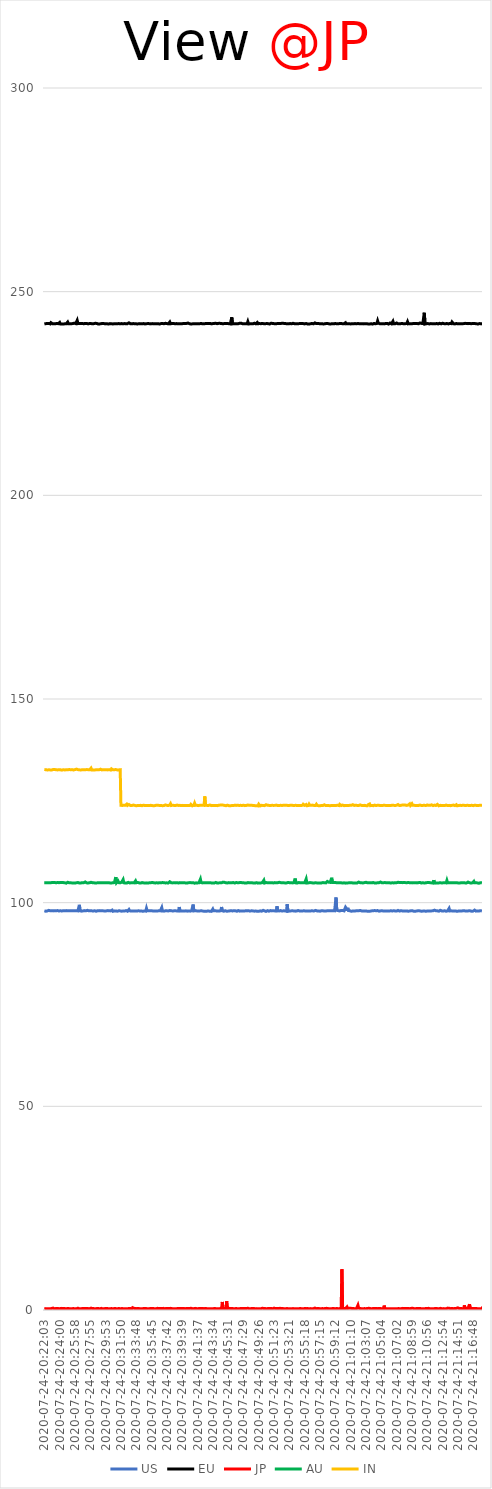
| Category | US | EU | JP | AU | IN |
|---|---|---|---|---|---|
| 2020-07-24-20:22:03 | 98.004 | 242.094 | 0.312 | 104.917 | 132.697 |
| 2020-07-24-20:22:08 | 98.008 | 242.156 | 0.376 | 104.929 | 132.523 |
| 2020-07-24-20:22:14 | 97.902 | 242.138 | 0.339 | 104.917 | 132.633 |
| 2020-07-24-20:22:20 | 97.986 | 242.236 | 0.309 | 104.878 | 132.759 |
| 2020-07-24-20:22:25 | 97.966 | 242.196 | 0.328 | 104.888 | 132.587 |
| 2020-07-24-20:22:31 | 98.046 | 242.124 | 0.321 | 104.858 | 132.568 |
| 2020-07-24-20:22:36 | 98.113 | 242.201 | 0.301 | 104.906 | 132.607 |
| 2020-07-24-20:22:42 | 98.022 | 242.107 | 0.298 | 104.881 | 132.682 |
| 2020-07-24-20:22:48 | 98.019 | 242.09 | 0.294 | 104.88 | 132.597 |
| 2020-07-24-20:22:53 | 98.047 | 242.385 | 0.294 | 104.947 | 132.607 |
| 2020-07-24-20:22:59 | 98.038 | 242.17 | 0.373 | 104.932 | 132.574 |
| 2020-07-24-20:23:04 | 97.975 | 242.144 | 0.353 | 104.883 | 132.554 |
| 2020-07-24-20:23:10 | 97.98 | 242.132 | 0.47 | 104.967 | 132.696 |
| 2020-07-24-20:23:16 | 97.97 | 242.138 | 0.304 | 104.886 | 132.573 |
| 2020-07-24-20:23:21 | 98.042 | 242.142 | 0.296 | 104.967 | 132.712 |
| 2020-07-24-20:23:27 | 98.04 | 242.104 | 0.345 | 104.941 | 132.658 |
| 2020-07-24-20:23:32 | 98.031 | 242.161 | 0.376 | 104.883 | 132.614 |
| 2020-07-24-20:23:38 | 98.014 | 242.209 | 0.34 | 104.906 | 132.591 |
| 2020-07-24-20:23:44 | 98.052 | 242.055 | 0.389 | 104.95 | 132.595 |
| 2020-07-24-20:23:49 | 97.982 | 242.134 | 0.334 | 104.937 | 132.639 |
| 2020-07-24-20:23:55 | 97.957 | 242.131 | 0.321 | 104.91 | 132.62 |
| 2020-07-24-20:24:00 | 97.969 | 242.441 | 0.339 | 104.934 | 132.683 |
| 2020-07-24-20:24:06 | 98.016 | 242.08 | 0.347 | 104.949 | 132.62 |
| 2020-07-24-20:24:12 | 98.004 | 242.171 | 0.315 | 104.845 | 132.594 |
| 2020-07-24-20:24:17 | 97.952 | 242.062 | 0.399 | 104.959 | 132.536 |
| 2020-07-24-20:24:23 | 98.084 | 242.069 | 0.296 | 104.878 | 132.609 |
| 2020-07-24-20:24:28 | 98.033 | 242.077 | 0.345 | 104.928 | 132.645 |
| 2020-07-24-20:24:34 | 97.935 | 242.108 | 0.302 | 104.833 | 132.636 |
| 2020-07-24-20:24:40 | 98.025 | 242.098 | 0.357 | 104.883 | 132.584 |
| 2020-07-24-20:24:45 | 97.975 | 242.148 | 0.355 | 104.937 | 132.655 |
| 2020-07-24-20:24:51 | 98.048 | 242.101 | 0.284 | 104.789 | 132.625 |
| 2020-07-24-20:24:56 | 98.016 | 242.135 | 0.404 | 104.945 | 132.583 |
| 2020-07-24-20:25:02 | 98.017 | 242.535 | 0.381 | 105.006 | 132.601 |
| 2020-07-24-20:25:07 | 97.929 | 242.134 | 0.366 | 105.055 | 132.639 |
| 2020-07-24-20:25:13 | 97.986 | 242.194 | 0.338 | 104.874 | 132.694 |
| 2020-07-24-20:25:19 | 97.996 | 242.111 | 0.358 | 104.933 | 132.565 |
| 2020-07-24-20:25:24 | 98.034 | 242.125 | 0.304 | 104.863 | 132.636 |
| 2020-07-24-20:25:30 | 98.06 | 242.123 | 0.339 | 104.893 | 132.62 |
| 2020-07-24-20:25:35 | 98.03 | 242.163 | 0.332 | 104.854 | 132.667 |
| 2020-07-24-20:25:41 | 97.991 | 242.171 | 0.356 | 104.853 | 132.667 |
| 2020-07-24-20:25:47 | 98.004 | 242.156 | 0.35 | 104.806 | 132.577 |
| 2020-07-24-20:25:52 | 98.011 | 242.271 | 0.395 | 104.87 | 132.635 |
| 2020-07-24-20:25:58 | 97.989 | 242.104 | 0.285 | 104.826 | 132.668 |
| 2020-07-24-20:26:03 | 97.936 | 242.149 | 0.346 | 104.937 | 132.628 |
| 2020-07-24-20:26:09 | 98.031 | 242.076 | 0.287 | 104.877 | 132.781 |
| 2020-07-24-20:26:15 | 97.905 | 242.943 | 0.349 | 104.746 | 132.598 |
| 2020-07-24-20:26:20 | 97.985 | 242.158 | 0.444 | 104.948 | 132.659 |
| 2020-07-24-20:26:26 | 98.032 | 242.121 | 0.346 | 104.924 | 132.569 |
| 2020-07-24-20:26:31 | 99.468 | 242.178 | 0.291 | 104.829 | 132.609 |
| 2020-07-24-20:26:37 | 98.009 | 242.088 | 0.344 | 104.87 | 132.571 |
| 2020-07-24-20:26:43 | 97.959 | 242.207 | 0.32 | 104.838 | 132.579 |
| 2020-07-24-20:26:48 | 97.921 | 242.14 | 0.317 | 104.899 | 132.668 |
| 2020-07-24-20:26:54 | 98.036 | 242.194 | 0.35 | 104.909 | 132.626 |
| 2020-07-24-20:26:59 | 97.978 | 242.205 | 0.42 | 104.875 | 132.693 |
| 2020-07-24-20:27:05 | 98.018 | 242.122 | 0.347 | 104.902 | 132.634 |
| 2020-07-24-20:27:11 | 98.048 | 242.181 | 0.352 | 104.855 | 132.626 |
| 2020-07-24-20:27:16 | 97.971 | 242.208 | 0.362 | 105.095 | 132.648 |
| 2020-07-24-20:27:22 | 98.004 | 242.185 | 0.305 | 104.928 | 132.628 |
| 2020-07-24-20:27:27 | 97.999 | 242.187 | 0.344 | 104.859 | 132.666 |
| 2020-07-24-20:27:33 | 98.112 | 242.129 | 0.33 | 104.857 | 132.697 |
| 2020-07-24-20:27:39 | 97.989 | 242.097 | 0.344 | 104.84 | 132.658 |
| 2020-07-24-20:27:44 | 98.007 | 242.161 | 0.361 | 104.968 | 132.673 |
| 2020-07-24-20:27:50 | 97.998 | 242.181 | 0.314 | 104.888 | 132.657 |
| 2020-07-24-20:27:55 | 98.001 | 242.142 | 0.36 | 104.943 | 132.634 |
| 2020-07-24-20:28:01 | 98.012 | 242.17 | 0.459 | 104.997 | 133.035 |
| 2020-07-24-20:28:07 | 97.987 | 242.107 | 0.328 | 104.904 | 132.574 |
| 2020-07-24-20:28:12 | 97.987 | 242.117 | 0.343 | 104.899 | 132.685 |
| 2020-07-24-20:28:18 | 97.97 | 242.163 | 0.383 | 104.898 | 132.576 |
| 2020-07-24-20:28:23 | 97.988 | 242.156 | 0.338 | 104.863 | 132.64 |
| 2020-07-24-20:28:29 | 98.004 | 242.152 | 0.345 | 104.897 | 132.578 |
| 2020-07-24-20:28:34 | 97.994 | 242.236 | 0.311 | 104.847 | 132.601 |
| 2020-07-24-20:28:40 | 97.886 | 242.056 | 0.301 | 104.862 | 132.625 |
| 2020-07-24-20:28:46 | 97.956 | 242.193 | 0.349 | 104.858 | 132.583 |
| 2020-07-24-20:28:51 | 98.029 | 242.24 | 0.359 | 104.906 | 132.614 |
| 2020-07-24-20:28:57 | 97.996 | 242.048 | 0.37 | 104.87 | 132.627 |
| 2020-07-24-20:29:02 | 98.046 | 242.119 | 0.359 | 104.996 | 132.607 |
| 2020-07-24-20:29:08 | 97.99 | 242.085 | 0.294 | 104.887 | 132.594 |
| 2020-07-24-20:29:14 | 98.029 | 242.159 | 0.318 | 104.919 | 132.774 |
| 2020-07-24-20:29:19 | 98.033 | 242.151 | 0.396 | 104.918 | 132.675 |
| 2020-07-24-20:29:25 | 98.017 | 242.081 | 0.357 | 104.866 | 132.595 |
| 2020-07-24-20:29:30 | 98.025 | 242.183 | 0.304 | 104.918 | 132.672 |
| 2020-07-24-20:29:36 | 97.985 | 242.125 | 0.334 | 104.828 | 132.621 |
| 2020-07-24-20:29:42 | 98.008 | 242.153 | 0.316 | 104.862 | 132.599 |
| 2020-07-24-20:29:47 | 97.952 | 242.205 | 0.289 | 104.948 | 132.632 |
| 2020-07-24-20:29:53 | 98.064 | 242.092 | 0.375 | 104.863 | 132.633 |
| 2020-07-24-20:29:58 | 97.984 | 242.16 | 0.326 | 104.99 | 132.644 |
| 2020-07-24-20:30:04 | 98.061 | 242.12 | 0.37 | 104.917 | 132.769 |
| 2020-07-24-20:30:10 | 98.059 | 242.187 | 0.298 | 104.886 | 132.594 |
| 2020-07-24-20:30:15 | 97.968 | 242.06 | 0.303 | 104.912 | 132.616 |
| 2020-07-24-20:30:21 | 97.993 | 242.108 | 0.381 | 104.876 | 132.661 |
| 2020-07-24-20:30:26 | 97.926 | 242.16 | 0.307 | 104.837 | 132.697 |
| 2020-07-24-20:30:32 | 97.984 | 242.125 | 0.319 | 104.878 | 132.558 |
| 2020-07-24-20:30:38 | 98.042 | 242.113 | 0.355 | 104.829 | 132.848 |
| 2020-07-24-20:30:43 | 98.174 | 242.102 | 0.314 | 104.966 | 132.824 |
| 2020-07-24-20:30:49 | 97.884 | 242.079 | 0.281 | 104.897 | 132.615 |
| 2020-07-24-20:30:54 | 97.933 | 242.168 | 0.372 | 104.848 | 132.584 |
| 2020-07-24-20:31:00 | 97.985 | 242.126 | 0.369 | 104.922 | 132.641 |
| 2020-07-24-20:31:06 | 97.978 | 242.206 | 0.32 | 104.93 | 132.7 |
| 2020-07-24-20:31:11 | 97.97 | 242.148 | 0.342 | 106.278 | 132.679 |
| 2020-07-24-20:31:17 | 97.96 | 242.113 | 0.325 | 104.905 | 132.664 |
| 2020-07-24-20:31:22 | 97.902 | 242.113 | 0.302 | 104.902 | 132.592 |
| 2020-07-24-20:31:28 | 98.011 | 242.089 | 0.334 | 105.322 | 132.62 |
| 2020-07-24-20:31:33 | 97.998 | 242.167 | 0.364 | 104.918 | 132.6 |
| 2020-07-24-20:31:39 | 98.008 | 242.103 | 0.432 | 105.11 | 132.679 |
| 2020-07-24-20:31:45 | 97.981 | 242.112 | 0.317 | 104.877 | 132.634 |
| 2020-07-24-20:31:50 | 97.987 | 242.184 | 0.359 | 104.895 | 123.892 |
| 2020-07-24-20:31:56 | 97.912 | 242.16 | 0.344 | 105.018 | 123.856 |
| 2020-07-24-20:32:01 | 97.978 | 242.098 | 0.455 | 104.878 | 123.874 |
| 2020-07-24-20:32:07 | 97.942 | 242.115 | 0.335 | 105.665 | 123.895 |
| 2020-07-24-20:32:13 | 98.01 | 242.211 | 0.383 | 104.885 | 123.903 |
| 2020-07-24-20:32:18 | 97.947 | 242.157 | 0.289 | 104.835 | 123.78 |
| 2020-07-24-20:32:24 | 98.004 | 242.117 | 0.329 | 104.818 | 123.891 |
| 2020-07-24-20:32:29 | 98.051 | 242.148 | 0.317 | 104.848 | 123.826 |
| 2020-07-24-20:32:35 | 97.942 | 242.176 | 0.334 | 104.824 | 124.188 |
| 2020-07-24-20:32:41 | 97.903 | 242.151 | 0.314 | 104.801 | 123.88 |
| 2020-07-24-20:32:46 | 97.957 | 242.116 | 0.314 | 104.984 | 123.879 |
| 2020-07-24-20:32:52 | 98.319 | 242.348 | 0.371 | 104.869 | 124.101 |
| 2020-07-24-20:32:57 | 97.988 | 242.164 | 0.362 | 104.851 | 123.889 |
| 2020-07-24-20:33:03 | 97.914 | 242.124 | 0.351 | 104.858 | 123.855 |
| 2020-07-24-20:33:08 | 97.966 | 242.175 | 0.35 | 104.867 | 123.902 |
| 2020-07-24-20:33:14 | 97.891 | 242.113 | 0.292 | 104.837 | 123.856 |
| 2020-07-24-20:33:20 | 97.962 | 242.119 | 0.57 | 104.895 | 123.824 |
| 2020-07-24-20:33:25 | 97.971 | 242.173 | 0.406 | 104.948 | 123.96 |
| 2020-07-24-20:33:31 | 97.974 | 242.14 | 0.4 | 104.862 | 124.056 |
| 2020-07-24-20:33:36 | 98.003 | 242.099 | 0.345 | 104.9 | 123.871 |
| 2020-07-24-20:33:42 | 97.951 | 242.105 | 0.371 | 105.352 | 123.875 |
| 2020-07-24-20:33:48 | 98.034 | 242.097 | 0.312 | 104.89 | 123.787 |
| 2020-07-24-20:33:53 | 97.928 | 242.092 | 0.332 | 104.821 | 123.849 |
| 2020-07-24-20:33:59 | 98.023 | 242.08 | 0.327 | 104.965 | 123.857 |
| 2020-07-24-20:34:04 | 98.02 | 242.13 | 0.367 | 105.005 | 124.08 |
| 2020-07-24-20:34:10 | 98.094 | 242.154 | 0.361 | 104.861 | 123.865 |
| 2020-07-24-20:34:16 | 97.954 | 242.2 | 0.321 | 104.83 | 123.895 |
| 2020-07-24-20:34:21 | 97.923 | 242.121 | 0.34 | 104.81 | 123.889 |
| 2020-07-24-20:34:27 | 97.972 | 242.144 | 0.286 | 104.852 | 123.779 |
| 2020-07-24-20:34:32 | 98.179 | 242.127 | 0.31 | 104.935 | 123.804 |
| 2020-07-24-20:34:38 | 97.888 | 242.121 | 0.335 | 104.855 | 123.846 |
| 2020-07-24-20:34:43 | 97.908 | 242.163 | 0.311 | 104.858 | 123.92 |
| 2020-07-24-20:34:49 | 97.949 | 242.138 | 0.383 | 104.868 | 123.897 |
| 2020-07-24-20:34:55 | 97.989 | 242.077 | 0.346 | 104.83 | 123.847 |
| 2020-07-24-20:35:00 | 97.923 | 242.107 | 0.396 | 105.021 | 123.921 |
| 2020-07-24-20:35:06 | 98.616 | 242.147 | 0.373 | 104.86 | 123.843 |
| 2020-07-24-20:35:11 | 97.988 | 242.117 | 0.289 | 104.825 | 123.764 |
| 2020-07-24-20:35:17 | 97.956 | 242.161 | 0.349 | 104.803 | 123.857 |
| 2020-07-24-20:35:23 | 98.019 | 242.14 | 0.289 | 104.816 | 123.875 |
| 2020-07-24-20:35:28 | 98.041 | 242.15 | 0.338 | 104.887 | 123.831 |
| 2020-07-24-20:35:34 | 98.032 | 242.268 | 0.36 | 104.912 | 123.912 |
| 2020-07-24-20:35:39 | 98.033 | 242.094 | 0.325 | 104.895 | 123.9 |
| 2020-07-24-20:35:45 | 98.006 | 242.114 | 0.352 | 104.831 | 123.868 |
| 2020-07-24-20:35:50 | 98.018 | 242.16 | 0.354 | 104.966 | 123.839 |
| 2020-07-24-20:35:56 | 97.97 | 242.068 | 0.358 | 104.912 | 124.001 |
| 2020-07-24-20:36:02 | 98.07 | 242.119 | 0.424 | 104.875 | 123.786 |
| 2020-07-24-20:36:07 | 97.978 | 242.324 | 0.324 | 104.933 | 123.881 |
| 2020-07-24-20:36:13 | 97.9 | 242.148 | 0.354 | 104.842 | 123.845 |
| 2020-07-24-20:36:18 | 97.979 | 242.114 | 0.273 | 104.826 | 123.815 |
| 2020-07-24-20:36:24 | 97.998 | 242.109 | 0.332 | 104.88 | 123.94 |
| 2020-07-24-20:36:30 | 97.959 | 242.08 | 0.406 | 104.833 | 123.952 |
| 2020-07-24-20:36:35 | 98.009 | 242.115 | 0.361 | 104.84 | 123.908 |
| 2020-07-24-20:36:41 | 98.007 | 242.118 | 0.336 | 104.927 | 123.883 |
| 2020-07-24-20:36:46 | 97.979 | 242.067 | 0.323 | 104.916 | 123.853 |
| 2020-07-24-20:36:52 | 97.99 | 242.218 | 0.365 | 104.922 | 123.83 |
| 2020-07-24-20:36:57 | 98.009 | 242.168 | 0.315 | 104.869 | 123.838 |
| 2020-07-24-20:37:03 | 98.791 | 242.093 | 0.344 | 104.865 | 123.841 |
| 2020-07-24-20:37:09 | 97.953 | 242.179 | 0.312 | 104.931 | 123.816 |
| 2020-07-24-20:37:14 | 97.985 | 242.116 | 0.403 | 104.962 | 124.022 |
| 2020-07-24-20:37:20 | 97.917 | 242.134 | 0.345 | 104.91 | 123.83 |
| 2020-07-24-20:37:25 | 97.897 | 242.159 | 0.301 | 104.822 | 123.922 |
| 2020-07-24-20:37:31 | 97.995 | 242.231 | 0.442 | 104.845 | 123.994 |
| 2020-07-24-20:37:37 | 97.903 | 242.15 | 0.382 | 104.833 | 124.142 |
| 2020-07-24-20:37:42 | 97.995 | 242.165 | 0.3 | 104.866 | 123.894 |
| 2020-07-24-20:37:48 | 98.009 | 242.126 | 0.369 | 104.751 | 123.878 |
| 2020-07-24-20:37:53 | 97.971 | 242.11 | 0.426 | 104.831 | 123.847 |
| 2020-07-24-20:37:59 | 97.931 | 242.064 | 0.336 | 104.859 | 123.97 |
| 2020-07-24-20:38:05 | 98.066 | 242.549 | 0.424 | 105.139 | 123.979 |
| 2020-07-24-20:38:10 | 97.912 | 242.115 | 0.406 | 105.055 | 124.292 |
| 2020-07-24-20:38:16 | 98.01 | 242.142 | 0.336 | 104.884 | 123.858 |
| 2020-07-24-20:38:21 | 97.927 | 242.181 | 0.338 | 104.871 | 123.92 |
| 2020-07-24-20:38:27 | 97.961 | 242.155 | 0.336 | 104.854 | 123.931 |
| 2020-07-24-20:38:32 | 97.957 | 242.203 | 0.328 | 104.829 | 123.845 |
| 2020-07-24-20:38:38 | 97.997 | 242.147 | 0.331 | 104.872 | 123.861 |
| 2020-07-24-20:38:44 | 98.067 | 242.122 | 0.331 | 104.916 | 123.871 |
| 2020-07-24-20:38:49 | 97.998 | 242.129 | 0.36 | 104.857 | 123.856 |
| 2020-07-24-20:38:55 | 98.004 | 242.159 | 0.32 | 104.875 | 123.806 |
| 2020-07-24-20:39:00 | 97.968 | 242.118 | 0.329 | 104.908 | 123.958 |
| 2020-07-24-20:39:06 | 98.044 | 242.133 | 0.374 | 104.84 | 123.961 |
| 2020-07-24-20:39:12 | 97.954 | 242.128 | 0.294 | 104.827 | 123.874 |
| 2020-07-24-20:39:17 | 98.918 | 242.107 | 0.356 | 104.811 | 123.805 |
| 2020-07-24-20:39:23 | 97.981 | 242.343 | 0.343 | 104.917 | 123.889 |
| 2020-07-24-20:39:28 | 97.991 | 242.15 | 0.342 | 104.844 | 123.848 |
| 2020-07-24-20:39:34 | 97.954 | 242.155 | 0.343 | 104.88 | 123.852 |
| 2020-07-24-20:39:39 | 97.978 | 242.144 | 0.339 | 104.893 | 123.865 |
| 2020-07-24-20:39:45 | 97.963 | 242.081 | 0.285 | 104.877 | 123.885 |
| 2020-07-24-20:39:51 | 98.018 | 242.182 | 0.356 | 104.887 | 123.855 |
| 2020-07-24-20:39:56 | 97.936 | 242.133 | 0.323 | 104.887 | 123.859 |
| 2020-07-24-20:40:02 | 98.026 | 242.164 | 0.328 | 104.871 | 123.872 |
| 2020-07-24-20:40:07 | 97.994 | 242.206 | 0.421 | 104.83 | 123.856 |
| 2020-07-24-20:40:13 | 97.873 | 242.209 | 0.351 | 104.906 | 123.89 |
| 2020-07-24-20:40:19 | 97.922 | 242.166 | 0.3 | 104.836 | 123.876 |
| 2020-07-24-20:40:24 | 97.996 | 242.295 | 0.349 | 104.879 | 123.962 |
| 2020-07-24-20:40:30 | 97.93 | 242.142 | 0.342 | 104.909 | 123.835 |
| 2020-07-24-20:40:35 | 98.008 | 242.133 | 0.362 | 104.926 | 123.845 |
| 2020-07-24-20:40:41 | 97.922 | 242.161 | 0.313 | 104.93 | 123.876 |
| 2020-07-24-20:40:46 | 98.035 | 242.07 | 0.419 | 105.018 | 124.142 |
| 2020-07-24-20:40:52 | 98.042 | 242.107 | 0.408 | 104.877 | 123.933 |
| 2020-07-24-20:40:58 | 97.963 | 242.094 | 0.328 | 104.873 | 123.784 |
| 2020-07-24-20:41:03 | 99.537 | 242.154 | 0.364 | 104.905 | 123.889 |
| 2020-07-24-20:41:09 | 97.974 | 242.123 | 0.337 | 104.905 | 123.926 |
| 2020-07-24-20:41:14 | 97.911 | 242.213 | 0.374 | 104.778 | 124.412 |
| 2020-07-24-20:41:20 | 98.05 | 242.124 | 0.396 | 104.989 | 123.887 |
| 2020-07-24-20:41:26 | 97.941 | 242.135 | 0.316 | 104.862 | 123.835 |
| 2020-07-24-20:41:31 | 97.972 | 242.118 | 0.328 | 104.904 | 123.914 |
| 2020-07-24-20:41:37 | 97.985 | 242.072 | 0.319 | 104.846 | 123.815 |
| 2020-07-24-20:41:42 | 97.964 | 242.103 | 0.329 | 104.833 | 123.826 |
| 2020-07-24-20:41:48 | 97.954 | 242.12 | 0.353 | 104.89 | 123.846 |
| 2020-07-24-20:41:54 | 97.963 | 242.138 | 0.393 | 104.891 | 123.901 |
| 2020-07-24-20:41:59 | 98.112 | 242.208 | 0.375 | 105.77 | 123.856 |
| 2020-07-24-20:42:05 | 98.018 | 242.183 | 0.371 | 104.937 | 123.924 |
| 2020-07-24-20:42:10 | 97.996 | 242.11 | 0.314 | 104.91 | 123.907 |
| 2020-07-24-20:42:16 | 97.943 | 242.113 | 0.367 | 104.854 | 123.908 |
| 2020-07-24-20:42:21 | 97.928 | 242.294 | 0.325 | 104.83 | 123.797 |
| 2020-07-24-20:42:27 | 97.898 | 242.105 | 0.322 | 104.892 | 123.884 |
| 2020-07-24-20:42:33 | 97.95 | 242.087 | 0.367 | 104.89 | 126.097 |
| 2020-07-24-20:42:38 | 97.912 | 242.172 | 0.392 | 104.892 | 123.948 |
| 2020-07-24-20:42:44 | 97.91 | 242.158 | 0.336 | 104.871 | 123.865 |
| 2020-07-24-20:42:49 | 97.921 | 242.216 | 0.316 | 104.913 | 123.883 |
| 2020-07-24-20:42:55 | 97.968 | 242.126 | 0.326 | 104.874 | 123.796 |
| 2020-07-24-20:43:01 | 97.949 | 242.207 | 0.325 | 104.883 | 123.861 |
| 2020-07-24-20:43:06 | 97.939 | 242.247 | 0.304 | 104.777 | 123.959 |
| 2020-07-24-20:43:12 | 97.9 | 242.214 | 0.316 | 104.907 | 123.985 |
| 2020-07-24-20:43:17 | 98.009 | 242.082 | 0.3 | 104.921 | 123.92 |
| 2020-07-24-20:43:23 | 97.864 | 242.098 | 0.328 | 104.846 | 123.83 |
| 2020-07-24-20:43:28 | 97.933 | 242.105 | 0.361 | 104.891 | 123.829 |
| 2020-07-24-20:43:34 | 98.431 | 242.167 | 0.295 | 104.8 | 123.865 |
| 2020-07-24-20:43:40 | 98.018 | 242.051 | 0.331 | 104.865 | 123.873 |
| 2020-07-24-20:43:45 | 98.021 | 242.209 | 0.371 | 104.817 | 123.878 |
| 2020-07-24-20:43:51 | 98.026 | 242.098 | 0.338 | 104.854 | 123.867 |
| 2020-07-24-20:43:56 | 98.039 | 242.233 | 0.337 | 104.964 | 123.854 |
| 2020-07-24-20:44:02 | 97.975 | 242.088 | 0.327 | 104.896 | 123.879 |
| 2020-07-24-20:44:08 | 97.968 | 242.139 | 0.325 | 104.826 | 123.82 |
| 2020-07-24-20:44:13 | 97.983 | 242.18 | 0.287 | 104.837 | 123.823 |
| 2020-07-24-20:44:19 | 98.145 | 242.217 | 0.314 | 104.857 | 123.912 |
| 2020-07-24-20:44:24 | 97.933 | 242.184 | 0.344 | 104.87 | 123.926 |
| 2020-07-24-20:44:30 | 98.016 | 242.216 | 0.346 | 104.861 | 123.958 |
| 2020-07-24-20:44:36 | 98.047 | 242.19 | 0.322 | 104.87 | 123.976 |
| 2020-07-24-20:44:41 | 98.929 | 242.176 | 0.333 | 104.869 | 123.967 |
| 2020-07-24-20:44:47 | 98.011 | 242.083 | 1.977 | 104.899 | 123.951 |
| 2020-07-24-20:44:52 | 98.011 | 242.102 | 0.323 | 105.042 | 123.95 |
| 2020-07-24-20:44:58 | 97.904 | 242.103 | 0.364 | 104.859 | 123.905 |
| 2020-07-24-20:45:03 | 98.012 | 242.19 | 0.394 | 104.991 | 123.88 |
| 2020-07-24-20:45:09 | 98.017 | 242.122 | 0.364 | 104.919 | 123.846 |
| 2020-07-24-20:45:15 | 97.953 | 242.194 | 0.308 | 104.871 | 123.805 |
| 2020-07-24-20:45:20 | 97.913 | 242.092 | 2.157 | 104.844 | 123.85 |
| 2020-07-24-20:45:26 | 97.995 | 242.205 | 0.327 | 104.843 | 123.937 |
| 2020-07-24-20:45:31 | 97.927 | 242.112 | 0.312 | 105.009 | 123.9 |
| 2020-07-24-20:45:37 | 98.029 | 242.127 | 0.407 | 104.925 | 123.811 |
| 2020-07-24-20:45:43 | 97.984 | 242.171 | 0.615 | 104.854 | 123.846 |
| 2020-07-24-20:45:48 | 97.95 | 242.084 | 0.375 | 104.884 | 123.793 |
| 2020-07-24-20:45:54 | 98.018 | 242.134 | 0.339 | 104.89 | 123.845 |
| 2020-07-24-20:45:59 | 97.936 | 243.71 | 0.369 | 104.894 | 123.839 |
| 2020-07-24-20:46:05 | 97.975 | 242.095 | 0.359 | 104.947 | 123.863 |
| 2020-07-24-20:46:10 | 97.956 | 242.25 | 0.335 | 104.943 | 123.836 |
| 2020-07-24-20:46:16 | 98.02 | 242.132 | 0.319 | 104.913 | 123.834 |
| 2020-07-24-20:46:22 | 98.013 | 242.151 | 0.301 | 104.822 | 123.912 |
| 2020-07-24-20:46:27 | 98.001 | 242.128 | 0.306 | 104.869 | 123.843 |
| 2020-07-24-20:46:33 | 98.065 | 242.258 | 0.373 | 104.943 | 123.879 |
| 2020-07-24-20:46:38 | 97.893 | 242.11 | 0.368 | 104.792 | 123.857 |
| 2020-07-24-20:46:44 | 97.962 | 242.133 | 0.278 | 104.897 | 123.933 |
| 2020-07-24-20:46:50 | 98.061 | 242.14 | 0.302 | 104.817 | 123.871 |
| 2020-07-24-20:46:55 | 97.986 | 242.123 | 0.278 | 104.907 | 123.865 |
| 2020-07-24-20:47:01 | 97.92 | 242.261 | 0.348 | 104.893 | 123.804 |
| 2020-07-24-20:47:06 | 98.043 | 242.178 | 0.388 | 104.957 | 123.896 |
| 2020-07-24-20:47:12 | 97.968 | 242.247 | 0.389 | 104.83 | 123.778 |
| 2020-07-24-20:47:18 | 97.953 | 242.221 | 0.378 | 104.91 | 123.857 |
| 2020-07-24-20:47:23 | 97.947 | 242.117 | 0.302 | 104.838 | 123.79 |
| 2020-07-24-20:47:29 | 97.994 | 242.132 | 0.336 | 104.888 | 123.918 |
| 2020-07-24-20:47:34 | 97.959 | 242.144 | 0.337 | 104.92 | 123.922 |
| 2020-07-24-20:47:40 | 97.97 | 242.169 | 0.348 | 104.823 | 123.822 |
| 2020-07-24-20:47:45 | 97.999 | 242.12 | 0.366 | 104.899 | 123.87 |
| 2020-07-24-20:47:51 | 98.03 | 242.132 | 0.368 | 104.802 | 123.871 |
| 2020-07-24-20:47:57 | 97.982 | 242.149 | 0.319 | 104.88 | 123.836 |
| 2020-07-24-20:48:02 | 97.915 | 242.652 | 0.427 | 104.935 | 123.972 |
| 2020-07-24-20:48:08 | 98.026 | 242.074 | 0.407 | 104.844 | 123.906 |
| 2020-07-24-20:48:13 | 98.057 | 242.091 | 0.324 | 104.897 | 123.908 |
| 2020-07-24-20:48:19 | 97.926 | 242.108 | 0.363 | 104.828 | 123.862 |
| 2020-07-24-20:48:25 | 97.953 | 242.106 | 0.331 | 104.904 | 123.94 |
| 2020-07-24-20:48:30 | 97.999 | 242.123 | 0.308 | 104.858 | 123.866 |
| 2020-07-24-20:48:36 | 98.054 | 242.141 | 0.387 | 104.885 | 123.887 |
| 2020-07-24-20:48:41 | 97.977 | 242.106 | 0.331 | 104.825 | 123.904 |
| 2020-07-24-20:48:47 | 97.88 | 242.138 | 0.364 | 104.809 | 123.853 |
| 2020-07-24-20:48:52 | 97.914 | 242.258 | 0.31 | 104.864 | 123.798 |
| 2020-07-24-20:48:58 | 97.95 | 242.041 | 0.32 | 104.822 | 123.807 |
| 2020-07-24-20:49:04 | 97.95 | 242.104 | 0.344 | 104.88 | 123.861 |
| 2020-07-24-20:49:09 | 97.959 | 242.278 | 0.338 | 104.908 | 123.781 |
| 2020-07-24-20:49:15 | 97.887 | 242.43 | 0.321 | 104.871 | 123.784 |
| 2020-07-24-20:49:20 | 97.917 | 242.132 | 0.308 | 104.797 | 123.759 |
| 2020-07-24-20:49:26 | 97.887 | 242.092 | 0.376 | 104.861 | 124.175 |
| 2020-07-24-20:49:32 | 97.911 | 242.17 | 0.313 | 104.842 | 124.07 |
| 2020-07-24-20:49:37 | 97.986 | 242.143 | 0.307 | 104.814 | 123.765 |
| 2020-07-24-20:49:43 | 98.009 | 242.139 | 0.317 | 104.848 | 123.849 |
| 2020-07-24-20:49:48 | 97.912 | 242.29 | 0.372 | 104.958 | 123.89 |
| 2020-07-24-20:49:54 | 98.025 | 242.209 | 0.422 | 104.929 | 123.873 |
| 2020-07-24-20:49:59 | 98.115 | 242.163 | 0.405 | 104.858 | 123.875 |
| 2020-07-24-20:50:05 | 98.019 | 242.128 | 0.37 | 105.493 | 123.977 |
| 2020-07-24-20:50:11 | 97.977 | 242.151 | 0.325 | 104.824 | 123.821 |
| 2020-07-24-20:50:16 | 97.99 | 242.14 | 0.342 | 104.862 | 123.913 |
| 2020-07-24-20:50:22 | 97.865 | 242.186 | 0.341 | 104.937 | 124.04 |
| 2020-07-24-20:50:27 | 98.067 | 242.172 | 0.315 | 104.859 | 123.927 |
| 2020-07-24-20:50:33 | 98.041 | 242.089 | 0.315 | 104.893 | 123.933 |
| 2020-07-24-20:50:39 | 97.929 | 242.138 | 0.367 | 104.842 | 123.866 |
| 2020-07-24-20:50:44 | 97.914 | 242.094 | 0.458 | 104.878 | 123.88 |
| 2020-07-24-20:50:50 | 97.917 | 242.059 | 0.367 | 104.811 | 124.02 |
| 2020-07-24-20:50:55 | 98.057 | 242.183 | 0.317 | 104.914 | 123.872 |
| 2020-07-24-20:51:01 | 97.984 | 242.249 | 0.367 | 104.896 | 123.817 |
| 2020-07-24-20:51:07 | 97.983 | 242.15 | 0.315 | 104.896 | 123.888 |
| 2020-07-24-20:51:12 | 97.904 | 242.197 | 0.308 | 104.86 | 123.889 |
| 2020-07-24-20:51:18 | 98.026 | 242.085 | 0.32 | 104.839 | 123.884 |
| 2020-07-24-20:51:23 | 98.009 | 242.145 | 0.458 | 104.855 | 123.868 |
| 2020-07-24-20:51:29 | 97.977 | 242.175 | 0.34 | 104.923 | 123.885 |
| 2020-07-24-20:51:34 | 97.943 | 242.112 | 0.337 | 104.958 | 123.879 |
| 2020-07-24-20:51:40 | 97.97 | 242.08 | 0.359 | 104.874 | 123.955 |
| 2020-07-24-20:51:46 | 99.13 | 242.156 | 0.388 | 104.897 | 123.9 |
| 2020-07-24-20:51:51 | 98.017 | 242.118 | 0.387 | 104.889 | 123.85 |
| 2020-07-24-20:51:57 | 98.09 | 242.16 | 0.363 | 104.973 | 124.034 |
| 2020-07-24-20:52:02 | 97.966 | 242.055 | 0.457 | 105.005 | 123.856 |
| 2020-07-24-20:52:08 | 98.078 | 242.184 | 0.411 | 104.835 | 123.822 |
| 2020-07-24-20:52:14 | 98.055 | 242.145 | 0.287 | 104.921 | 123.9 |
| 2020-07-24-20:52:19 | 98.013 | 242.215 | 0.369 | 104.884 | 123.872 |
| 2020-07-24-20:52:25 | 97.942 | 242.112 | 0.353 | 104.873 | 123.865 |
| 2020-07-24-20:52:30 | 98 | 242.259 | 0.371 | 104.929 | 124.087 |
| 2020-07-24-20:52:36 | 98.008 | 242.113 | 0.323 | 104.872 | 123.92 |
| 2020-07-24-20:52:41 | 97.943 | 242.172 | 0.293 | 104.831 | 123.848 |
| 2020-07-24-20:52:47 | 97.975 | 242.222 | 0.371 | 104.85 | 123.901 |
| 2020-07-24-20:52:53 | 97.984 | 242.156 | 0.326 | 104.872 | 123.818 |
| 2020-07-24-20:52:58 | 97.913 | 242.205 | 0.353 | 104.847 | 123.913 |
| 2020-07-24-20:53:04 | 99.615 | 242.11 | 0.353 | 104.945 | 123.912 |
| 2020-07-24-20:53:09 | 97.882 | 242.126 | 0.337 | 104.948 | 123.868 |
| 2020-07-24-20:53:15 | 98.013 | 242.116 | 0.286 | 104.845 | 123.834 |
| 2020-07-24-20:53:21 | 97.929 | 242.123 | 0.299 | 104.915 | 123.875 |
| 2020-07-24-20:53:26 | 97.945 | 242.174 | 0.295 | 104.958 | 123.861 |
| 2020-07-24-20:53:32 | 97.976 | 242.142 | 0.337 | 104.881 | 123.92 |
| 2020-07-24-20:53:37 | 97.927 | 242.114 | 0.324 | 104.946 | 123.851 |
| 2020-07-24-20:53:43 | 98.005 | 242.129 | 0.311 | 104.854 | 123.892 |
| 2020-07-24-20:53:49 | 97.973 | 242.23 | 0.342 | 104.908 | 123.849 |
| 2020-07-24-20:53:54 | 97.974 | 242.084 | 0.402 | 104.908 | 123.849 |
| 2020-07-24-20:54:00 | 97.947 | 242.142 | 0.322 | 104.839 | 124.032 |
| 2020-07-24-20:54:05 | 97.918 | 242.142 | 0.547 | 105.924 | 123.89 |
| 2020-07-24-20:54:11 | 97.998 | 242.106 | 0.313 | 104.853 | 123.858 |
| 2020-07-24-20:54:16 | 97.965 | 242.103 | 0.299 | 104.966 | 123.881 |
| 2020-07-24-20:54:22 | 97.94 | 242.128 | 0.319 | 104.831 | 123.892 |
| 2020-07-24-20:54:28 | 98.073 | 242.175 | 0.29 | 104.923 | 123.834 |
| 2020-07-24-20:54:33 | 98.009 | 242.15 | 0.319 | 104.949 | 123.83 |
| 2020-07-24-20:54:39 | 97.954 | 242.099 | 0.313 | 104.849 | 123.876 |
| 2020-07-24-20:54:44 | 97.918 | 242.189 | 0.371 | 104.879 | 123.822 |
| 2020-07-24-20:54:50 | 97.95 | 242.129 | 0.326 | 104.897 | 123.864 |
| 2020-07-24-20:54:56 | 98.061 | 242.184 | 0.309 | 104.861 | 123.856 |
| 2020-07-24-20:55:01 | 97.959 | 242.422 | 0.383 | 104.885 | 123.896 |
| 2020-07-24-20:55:07 | 98.011 | 242.162 | 0.315 | 104.865 | 124.158 |
| 2020-07-24-20:55:12 | 98.025 | 242.121 | 0.307 | 104.891 | 124.105 |
| 2020-07-24-20:55:18 | 97.947 | 242.089 | 0.355 | 104.869 | 123.901 |
| 2020-07-24-20:55:23 | 97.944 | 242.144 | 0.336 | 104.813 | 123.825 |
| 2020-07-24-20:55:29 | 98.131 | 242.194 | 0.336 | 105.814 | 124.093 |
| 2020-07-24-20:55:35 | 97.951 | 242.122 | 0.356 | 104.818 | 123.805 |
| 2020-07-24-20:55:40 | 97.912 | 242.057 | 0.356 | 104.988 | 123.851 |
| 2020-07-24-20:55:46 | 97.981 | 242.063 | 0.331 | 104.858 | 123.834 |
| 2020-07-24-20:55:51 | 98.047 | 242.067 | 0.314 | 104.965 | 124.178 |
| 2020-07-24-20:55:57 | 97.938 | 242.192 | 0.319 | 104.933 | 123.894 |
| 2020-07-24-20:56:03 | 97.972 | 242.118 | 0.344 | 104.903 | 123.846 |
| 2020-07-24-20:56:08 | 97.986 | 242.32 | 0.398 | 104.907 | 123.886 |
| 2020-07-24-20:56:14 | 98.015 | 242.191 | 0.299 | 104.849 | 123.807 |
| 2020-07-24-20:56:19 | 97.984 | 242.241 | 0.351 | 104.84 | 123.954 |
| 2020-07-24-20:56:25 | 97.995 | 242.106 | 0.321 | 104.846 | 123.878 |
| 2020-07-24-20:56:30 | 97.982 | 242.127 | 0.353 | 104.848 | 123.84 |
| 2020-07-24-20:56:36 | 98 | 242.346 | 0.476 | 104.849 | 123.89 |
| 2020-07-24-20:56:42 | 98.094 | 242.177 | 0.393 | 104.882 | 123.871 |
| 2020-07-24-20:56:47 | 97.928 | 242.167 | 0.321 | 104.87 | 124.149 |
| 2020-07-24-20:56:53 | 97.97 | 242.102 | 0.358 | 104.84 | 123.881 |
| 2020-07-24-20:56:58 | 97.959 | 242.209 | 0.37 | 104.856 | 123.881 |
| 2020-07-24-20:57:04 | 97.977 | 242.106 | 0.328 | 104.844 | 123.795 |
| 2020-07-24-20:57:10 | 97.97 | 242.142 | 0.338 | 104.846 | 123.866 |
| 2020-07-24-20:57:15 | 97.91 | 242.106 | 0.375 | 104.818 | 123.791 |
| 2020-07-24-20:57:21 | 98.015 | 242.128 | 0.303 | 104.898 | 123.869 |
| 2020-07-24-20:57:26 | 98.034 | 242.149 | 0.317 | 104.835 | 123.863 |
| 2020-07-24-20:57:32 | 98.021 | 242.111 | 0.346 | 104.886 | 123.846 |
| 2020-07-24-20:57:38 | 98.001 | 242.126 | 0.329 | 104.943 | 123.863 |
| 2020-07-24-20:57:43 | 97.947 | 242.067 | 0.329 | 104.865 | 124.003 |
| 2020-07-24-20:57:49 | 97.949 | 242.102 | 0.359 | 104.874 | 124.027 |
| 2020-07-24-20:57:54 | 97.972 | 242.138 | 0.35 | 104.919 | 123.908 |
| 2020-07-24-20:58:00 | 97.956 | 242.077 | 0.31 | 104.858 | 123.833 |
| 2020-07-24-20:58:05 | 98 | 242.179 | 0.409 | 104.891 | 123.93 |
| 2020-07-24-20:58:11 | 98.012 | 242.089 | 0.42 | 105.214 | 123.832 |
| 2020-07-24-20:58:17 | 97.918 | 242.16 | 0.345 | 105.02 | 123.868 |
| 2020-07-24-20:58:22 | 98.003 | 242.114 | 0.312 | 105.015 | 123.833 |
| 2020-07-24-20:58:28 | 98.005 | 242.082 | 0.299 | 104.936 | 123.851 |
| 2020-07-24-20:58:33 | 98.037 | 242.181 | 0.368 | 104.98 | 123.805 |
| 2020-07-24-20:58:39 | 98.004 | 242.08 | 0.321 | 104.985 | 123.869 |
| 2020-07-24-20:58:45 | 97.992 | 242.193 | 0.33 | 106.111 | 123.876 |
| 2020-07-24-20:58:50 | 98.041 | 242.144 | 0.347 | 104.969 | 123.823 |
| 2020-07-24-20:58:56 | 98.027 | 242.148 | 0.327 | 104.965 | 123.854 |
| 2020-07-24-20:59:01 | 97.95 | 242.096 | 0.364 | 104.95 | 123.956 |
| 2020-07-24-20:59:07 | 98.002 | 242.127 | 0.323 | 104.904 | 123.829 |
| 2020-07-24-20:59:12 | 97.937 | 242.19 | 0.298 | 104.958 | 123.894 |
| 2020-07-24-20:59:18 | 101.269 | 242.106 | 0.332 | 104.91 | 123.853 |
| 2020-07-24-20:59:24 | 98.126 | 242.102 | 0.388 | 104.878 | 123.924 |
| 2020-07-24-20:59:29 | 97.979 | 242.185 | 0.378 | 104.899 | 123.93 |
| 2020-07-24-20:59:35 | 98.042 | 242.11 | 0.298 | 104.908 | 123.833 |
| 2020-07-24-20:59:40 | 97.915 | 242.138 | 0.345 | 104.937 | 123.842 |
| 2020-07-24-20:59:46 | 97.967 | 242.181 | 0.347 | 104.889 | 124.134 |
| 2020-07-24-20:59:52 | 97.975 | 242.132 | 0.295 | 104.914 | 123.898 |
| 2020-07-24-20:59:57 | 98.1 | 242.164 | 0.331 | 104.882 | 123.837 |
| 2020-07-24-21:00:03 | 98.241 | 242.349 | 9.991 | 104.942 | 123.913 |
| 2020-07-24-21:00:08 | 98.081 | 242.144 | 0.382 | 104.808 | 123.961 |
| 2020-07-24-21:00:14 | 98.037 | 242.127 | 0.304 | 104.824 | 123.836 |
| 2020-07-24-21:00:20 | 97.985 | 242.126 | 0.393 | 104.876 | 123.817 |
| 2020-07-24-21:00:25 | 97.9 | 242.124 | 0.429 | 104.886 | 123.856 |
| 2020-07-24-21:00:31 | 98.891 | 242.377 | 0.323 | 104.794 | 123.858 |
| 2020-07-24-21:00:36 | 98.645 | 242.095 | 0.351 | 104.778 | 123.899 |
| 2020-07-24-21:00:42 | 98 | 242.111 | 0.742 | 104.834 | 123.839 |
| 2020-07-24-21:00:47 | 98.712 | 242.115 | 0.365 | 104.892 | 123.919 |
| 2020-07-24-21:00:53 | 98.055 | 242.111 | 0.333 | 104.863 | 123.861 |
| 2020-07-24-21:00:59 | 98 | 242.149 | 0.437 | 104.892 | 123.894 |
| 2020-07-24-21:01:04 | 98.016 | 242.163 | 0.348 | 104.881 | 123.899 |
| 2020-07-24-21:01:10 | 97.94 | 242.077 | 0.435 | 104.855 | 123.788 |
| 2020-07-24-21:01:15 | 97.901 | 242.278 | 0.303 | 104.904 | 123.906 |
| 2020-07-24-21:01:21 | 98.014 | 242.117 | 0.371 | 104.912 | 123.919 |
| 2020-07-24-21:01:27 | 97.943 | 242.218 | 0.352 | 104.839 | 124.052 |
| 2020-07-24-21:01:32 | 97.945 | 242.119 | 0.359 | 104.839 | 124.034 |
| 2020-07-24-21:01:38 | 97.94 | 242.17 | 0.319 | 104.847 | 123.868 |
| 2020-07-24-21:01:43 | 97.983 | 242.166 | 0.294 | 104.939 | 123.912 |
| 2020-07-24-21:01:49 | 97.985 | 242.116 | 0.337 | 104.815 | 123.938 |
| 2020-07-24-21:01:54 | 98.023 | 242.098 | 0.333 | 104.975 | 123.934 |
| 2020-07-24-21:02:00 | 98 | 242.126 | 0.331 | 104.849 | 123.864 |
| 2020-07-24-21:02:06 | 97.978 | 242.189 | 1.171 | 104.837 | 123.869 |
| 2020-07-24-21:02:11 | 98.004 | 242.134 | 0.442 | 105.048 | 123.849 |
| 2020-07-24-21:02:17 | 97.897 | 242.118 | 0.337 | 104.862 | 123.96 |
| 2020-07-24-21:02:22 | 98.088 | 242.133 | 0.341 | 104.903 | 123.992 |
| 2020-07-24-21:02:28 | 98.018 | 242.112 | 0.304 | 104.905 | 123.858 |
| 2020-07-24-21:02:34 | 97.97 | 242.224 | 0.335 | 104.885 | 123.873 |
| 2020-07-24-21:02:39 | 98.011 | 242.138 | 0.354 | 104.863 | 123.796 |
| 2020-07-24-21:02:45 | 97.947 | 242.093 | 0.321 | 104.838 | 123.859 |
| 2020-07-24-21:02:50 | 97.949 | 242.091 | 0.327 | 104.93 | 123.809 |
| 2020-07-24-21:02:56 | 97.962 | 242.058 | 0.343 | 104.924 | 123.888 |
| 2020-07-24-21:03:02 | 97.979 | 242.14 | 0.448 | 104.897 | 123.932 |
| 2020-07-24-21:03:07 | 97.955 | 242.297 | 0.328 | 104.997 | 123.822 |
| 2020-07-24-21:03:13 | 97.892 | 242.125 | 0.352 | 104.859 | 123.967 |
| 2020-07-24-21:03:18 | 97.898 | 242.151 | 0.374 | 104.878 | 123.795 |
| 2020-07-24-21:03:24 | 97.88 | 242.067 | 0.331 | 104.927 | 124.042 |
| 2020-07-24-21:03:29 | 97.914 | 242.107 | 0.419 | 104.894 | 123.918 |
| 2020-07-24-21:03:35 | 97.965 | 242.055 | 0.315 | 104.796 | 124.224 |
| 2020-07-24-21:03:41 | 97.917 | 242.158 | 0.344 | 104.871 | 123.822 |
| 2020-07-24-21:03:46 | 98.14 | 242.13 | 0.318 | 104.832 | 123.873 |
| 2020-07-24-21:03:52 | 97.99 | 242.142 | 0.308 | 104.862 | 123.85 |
| 2020-07-24-21:03:57 | 98.086 | 242.044 | 0.294 | 104.87 | 123.99 |
| 2020-07-24-21:04:03 | 98.029 | 242.253 | 0.376 | 104.95 | 123.812 |
| 2020-07-24-21:04:09 | 97.978 | 242.193 | 0.39 | 104.819 | 123.858 |
| 2020-07-24-21:04:14 | 98.056 | 242.231 | 0.351 | 104.817 | 123.95 |
| 2020-07-24-21:04:20 | 98.017 | 242.115 | 0.363 | 104.835 | 123.863 |
| 2020-07-24-21:04:25 | 98.029 | 242.096 | 0.396 | 104.826 | 123.839 |
| 2020-07-24-21:04:31 | 97.965 | 242.193 | 0.322 | 104.842 | 123.852 |
| 2020-07-24-21:04:36 | 98.053 | 242.827 | 0.325 | 104.897 | 123.925 |
| 2020-07-24-21:04:42 | 97.962 | 242.262 | 0.295 | 105.034 | 123.904 |
| 2020-07-24-21:04:48 | 97.907 | 242.239 | 0.391 | 104.909 | 123.899 |
| 2020-07-24-21:04:53 | 98.007 | 242.138 | 0.319 | 104.858 | 123.806 |
| 2020-07-24-21:04:59 | 97.986 | 242.177 | 0.351 | 105.062 | 123.829 |
| 2020-07-24-21:05:04 | 98.078 | 242.135 | 0.365 | 104.887 | 123.872 |
| 2020-07-24-21:05:10 | 98.007 | 242.365 | 0.317 | 104.88 | 123.827 |
| 2020-07-24-21:05:16 | 97.931 | 242.146 | 0.331 | 104.853 | 123.903 |
| 2020-07-24-21:05:21 | 97.959 | 242.18 | 0.318 | 104.903 | 123.902 |
| 2020-07-24-21:05:27 | 98.046 | 242.094 | 1.087 | 104.817 | 123.826 |
| 2020-07-24-21:05:32 | 97.958 | 242.134 | 0.375 | 104.934 | 123.892 |
| 2020-07-24-21:05:38 | 97.96 | 242.177 | 0.336 | 104.899 | 123.872 |
| 2020-07-24-21:05:44 | 97.939 | 242.174 | 0.321 | 104.891 | 123.856 |
| 2020-07-24-21:05:49 | 97.928 | 242.204 | 0.334 | 104.852 | 123.831 |
| 2020-07-24-21:05:55 | 97.968 | 242.118 | 0.314 | 104.893 | 123.843 |
| 2020-07-24-21:06:00 | 97.92 | 242.051 | 0.37 | 104.867 | 123.97 |
| 2020-07-24-21:06:06 | 97.941 | 242.138 | 0.328 | 104.914 | 123.845 |
| 2020-07-24-21:06:11 | 97.942 | 242.304 | 0.445 | 104.888 | 123.913 |
| 2020-07-24-21:06:17 | 98.017 | 242.131 | 0.273 | 104.811 | 123.85 |
| 2020-07-24-21:06:23 | 97.985 | 242.115 | 0.512 | 104.852 | 123.96 |
| 2020-07-24-21:06:28 | 97.961 | 242.118 | 0.33 | 104.885 | 123.937 |
| 2020-07-24-21:06:34 | 97.878 | 242.722 | 0.325 | 104.869 | 123.849 |
| 2020-07-24-21:06:39 | 98.019 | 242.126 | 0.319 | 104.852 | 123.89 |
| 2020-07-24-21:06:45 | 97.958 | 242.193 | 0.311 | 104.848 | 123.982 |
| 2020-07-24-21:06:51 | 97.96 | 242.112 | 0.289 | 104.874 | 123.864 |
| 2020-07-24-21:06:56 | 97.947 | 242.112 | 0.352 | 104.918 | 123.884 |
| 2020-07-24-21:07:02 | 97.935 | 242.304 | 0.299 | 104.898 | 123.899 |
| 2020-07-24-21:07:07 | 97.985 | 242.141 | 0.394 | 104.895 | 123.879 |
| 2020-07-24-21:07:13 | 98.098 | 242.107 | 0.343 | 105.012 | 124.084 |
| 2020-07-24-21:07:18 | 98.035 | 242.204 | 0.314 | 104.941 | 123.911 |
| 2020-07-24-21:07:24 | 97.937 | 242.116 | 0.335 | 104.946 | 123.854 |
| 2020-07-24-21:07:30 | 97.969 | 242.165 | 0.379 | 104.879 | 123.879 |
| 2020-07-24-21:07:35 | 98.031 | 242.154 | 0.312 | 104.946 | 123.895 |
| 2020-07-24-21:07:41 | 97.941 | 242.135 | 0.3 | 104.996 | 123.836 |
| 2020-07-24-21:07:46 | 97.967 | 242.161 | 0.399 | 104.916 | 123.977 |
| 2020-07-24-21:07:52 | 98.029 | 242.109 | 0.323 | 105.02 | 123.844 |
| 2020-07-24-21:07:58 | 97.934 | 242.135 | 0.384 | 104.94 | 123.946 |
| 2020-07-24-21:08:03 | 97.939 | 242.134 | 0.363 | 105.016 | 123.917 |
| 2020-07-24-21:08:09 | 97.96 | 242.146 | 0.39 | 104.923 | 123.955 |
| 2020-07-24-21:08:14 | 97.972 | 242.103 | 0.313 | 104.936 | 123.87 |
| 2020-07-24-21:08:20 | 97.971 | 242.172 | 0.379 | 104.892 | 123.879 |
| 2020-07-24-21:08:25 | 97.916 | 242.608 | 0.314 | 104.853 | 123.838 |
| 2020-07-24-21:08:31 | 97.899 | 242.093 | 0.363 | 104.955 | 123.973 |
| 2020-07-24-21:08:37 | 98.014 | 242.093 | 0.322 | 104.841 | 123.83 |
| 2020-07-24-21:08:42 | 97.963 | 242.098 | 0.323 | 104.891 | 124.26 |
| 2020-07-24-21:08:48 | 98.027 | 242.155 | 0.301 | 104.869 | 123.872 |
| 2020-07-24-21:08:53 | 98.01 | 242.1 | 0.395 | 104.88 | 123.9 |
| 2020-07-24-21:08:59 | 97.989 | 242.091 | 0.366 | 104.864 | 124.284 |
| 2020-07-24-21:09:05 | 97.99 | 242.151 | 0.426 | 104.859 | 123.93 |
| 2020-07-24-21:09:10 | 97.968 | 242.179 | 0.318 | 104.855 | 123.949 |
| 2020-07-24-21:09:16 | 97.885 | 242.204 | 0.339 | 104.903 | 123.9 |
| 2020-07-24-21:09:21 | 97.927 | 242.167 | 0.324 | 104.924 | 123.865 |
| 2020-07-24-21:09:27 | 97.908 | 242.174 | 0.32 | 104.9 | 123.856 |
| 2020-07-24-21:09:33 | 97.967 | 242.066 | 0.351 | 104.894 | 123.817 |
| 2020-07-24-21:09:38 | 97.964 | 242.189 | 0.382 | 104.855 | 123.834 |
| 2020-07-24-21:09:44 | 97.97 | 242.153 | 0.339 | 104.864 | 123.911 |
| 2020-07-24-21:09:49 | 98.03 | 242.114 | 0.369 | 104.912 | 123.858 |
| 2020-07-24-21:09:55 | 98.005 | 242.096 | 0.316 | 104.869 | 123.911 |
| 2020-07-24-21:10:00 | 97.976 | 242.312 | 0.376 | 104.97 | 123.963 |
| 2020-07-24-21:10:06 | 98.008 | 242.117 | 0.334 | 104.926 | 123.824 |
| 2020-07-24-21:10:12 | 97.905 | 242.216 | 0.324 | 104.819 | 123.867 |
| 2020-07-24-21:10:17 | 97.906 | 242.119 | 0.317 | 104.842 | 123.853 |
| 2020-07-24-21:10:23 | 97.93 | 242.16 | 0.321 | 104.907 | 123.877 |
| 2020-07-24-21:10:28 | 98.014 | 242.099 | 0.356 | 104.836 | 123.945 |
| 2020-07-24-21:10:34 | 97.968 | 244.825 | 0.311 | 104.811 | 123.915 |
| 2020-07-24-21:10:40 | 97.955 | 242.058 | 0.304 | 104.913 | 123.852 |
| 2020-07-24-21:10:45 | 97.892 | 242.116 | 0.356 | 104.883 | 123.839 |
| 2020-07-24-21:10:51 | 98.035 | 242.147 | 0.337 | 104.87 | 123.832 |
| 2020-07-24-21:10:56 | 97.945 | 242.12 | 0.346 | 104.928 | 123.978 |
| 2020-07-24-21:11:02 | 97.964 | 242.16 | 0.36 | 104.856 | 123.903 |
| 2020-07-24-21:11:07 | 97.931 | 242.043 | 0.407 | 104.953 | 123.886 |
| 2020-07-24-21:11:13 | 97.91 | 242.08 | 0.387 | 104.891 | 123.856 |
| 2020-07-24-21:11:19 | 97.962 | 242.126 | 0.279 | 104.898 | 123.887 |
| 2020-07-24-21:11:24 | 97.971 | 242.167 | 0.347 | 105.04 | 123.865 |
| 2020-07-24-21:11:30 | 97.981 | 242.114 | 0.335 | 104.856 | 124.018 |
| 2020-07-24-21:11:35 | 97.936 | 242.115 | 0.416 | 104.824 | 123.895 |
| 2020-07-24-21:11:41 | 98.011 | 242.165 | 0.318 | 104.811 | 123.821 |
| 2020-07-24-21:11:47 | 97.941 | 242.115 | 0.318 | 105.519 | 123.926 |
| 2020-07-24-21:11:52 | 98.167 | 242.097 | 0.342 | 104.85 | 123.943 |
| 2020-07-24-21:11:58 | 97.928 | 242.11 | 0.384 | 104.853 | 123.825 |
| 2020-07-24-21:12:03 | 98.006 | 242.115 | 0.343 | 104.796 | 123.859 |
| 2020-07-24-21:12:09 | 97.913 | 242.179 | 0.315 | 104.904 | 123.952 |
| 2020-07-24-21:12:15 | 97.987 | 242.164 | 0.337 | 104.858 | 124.124 |
| 2020-07-24-21:12:20 | 98.007 | 242.079 | 0.33 | 104.845 | 123.887 |
| 2020-07-24-21:12:26 | 97.909 | 242.138 | 0.294 | 104.854 | 123.784 |
| 2020-07-24-21:12:31 | 97.901 | 242.223 | 0.437 | 104.859 | 123.965 |
| 2020-07-24-21:12:37 | 98.13 | 242.176 | 0.403 | 104.889 | 123.897 |
| 2020-07-24-21:12:42 | 97.935 | 242.1 | 0.35 | 104.917 | 123.829 |
| 2020-07-24-21:12:48 | 97.968 | 242.168 | 0.331 | 104.841 | 123.842 |
| 2020-07-24-21:12:54 | 97.915 | 242.245 | 0.35 | 104.861 | 123.91 |
| 2020-07-24-21:12:59 | 97.954 | 242.142 | 0.339 | 104.872 | 123.848 |
| 2020-07-24-21:13:05 | 97.952 | 242.148 | 0.397 | 104.911 | 123.904 |
| 2020-07-24-21:13:10 | 98.014 | 242.29 | 0.315 | 104.902 | 123.839 |
| 2020-07-24-21:13:16 | 97.951 | 242.109 | 0.321 | 104.834 | 123.87 |
| 2020-07-24-21:13:22 | 97.898 | 242.135 | 0.299 | 104.856 | 123.952 |
| 2020-07-24-21:13:27 | 97.903 | 242.192 | 0.336 | 105.451 | 123.848 |
| 2020-07-24-21:13:33 | 97.996 | 242.177 | 0.458 | 104.87 | 123.842 |
| 2020-07-24-21:13:38 | 97.972 | 242.076 | 0.355 | 104.906 | 123.949 |
| 2020-07-24-21:13:44 | 98.592 | 242.211 | 0.423 | 104.915 | 123.883 |
| 2020-07-24-21:13:49 | 97.979 | 242.207 | 0.334 | 104.877 | 123.817 |
| 2020-07-24-21:13:55 | 97.955 | 242.124 | 0.325 | 104.867 | 123.811 |
| 2020-07-24-21:14:01 | 97.995 | 242.156 | 0.42 | 104.859 | 123.826 |
| 2020-07-24-21:14:06 | 97.982 | 242.556 | 0.394 | 104.871 | 123.892 |
| 2020-07-24-21:14:12 | 97.946 | 242.406 | 0.345 | 104.855 | 123.839 |
| 2020-07-24-21:14:17 | 98.043 | 242.128 | 0.325 | 104.889 | 123.956 |
| 2020-07-24-21:14:23 | 97.932 | 242.147 | 0.325 | 104.844 | 124.006 |
| 2020-07-24-21:14:29 | 97.924 | 242.081 | 0.368 | 104.868 | 123.83 |
| 2020-07-24-21:14:34 | 97.959 | 242.17 | 0.344 | 104.901 | 123.917 |
| 2020-07-24-21:14:40 | 97.959 | 242.174 | 0.397 | 104.878 | 124.047 |
| 2020-07-24-21:14:45 | 97.876 | 242.097 | 0.305 | 104.892 | 123.8 |
| 2020-07-24-21:14:51 | 97.992 | 242.109 | 0.529 | 104.854 | 123.935 |
| 2020-07-24-21:14:57 | 97.944 | 242.177 | 0.365 | 104.975 | 123.832 |
| 2020-07-24-21:15:02 | 97.993 | 242.111 | 0.356 | 104.81 | 123.857 |
| 2020-07-24-21:15:08 | 97.979 | 242.146 | 0.376 | 104.829 | 123.904 |
| 2020-07-24-21:15:13 | 98.014 | 242.091 | 0.392 | 104.882 | 123.799 |
| 2020-07-24-21:15:19 | 97.94 | 242.123 | 0.386 | 104.899 | 123.857 |
| 2020-07-24-21:15:24 | 97.931 | 242.123 | 0.317 | 104.865 | 123.861 |
| 2020-07-24-21:15:30 | 98.008 | 242.152 | 0.307 | 104.992 | 123.916 |
| 2020-07-24-21:15:36 | 97.992 | 242.157 | 0.323 | 104.886 | 123.901 |
| 2020-07-24-21:15:41 | 97.996 | 242.116 | 1.156 | 104.992 | 123.886 |
| 2020-07-24-21:15:47 | 98.093 | 242.223 | 0.359 | 104.854 | 124.04 |
| 2020-07-24-21:15:52 | 97.956 | 242.153 | 0.388 | 104.936 | 123.834 |
| 2020-07-24-21:15:58 | 97.976 | 242.187 | 0.351 | 104.853 | 123.887 |
| 2020-07-24-21:16:04 | 97.964 | 242.14 | 0.4 | 104.881 | 123.924 |
| 2020-07-24-21:16:09 | 97.957 | 242.148 | 0.37 | 105.058 | 123.874 |
| 2020-07-24-21:16:15 | 97.991 | 242.193 | 0.31 | 104.824 | 123.853 |
| 2020-07-24-21:16:20 | 98.018 | 242.211 | 1.417 | 104.886 | 123.845 |
| 2020-07-24-21:16:26 | 97.987 | 242.238 | 0.34 | 104.845 | 123.848 |
| 2020-07-24-21:16:31 | 97.987 | 242.132 | 0.379 | 104.817 | 123.908 |
| 2020-07-24-21:16:37 | 97.904 | 242.159 | 0.344 | 104.898 | 123.91 |
| 2020-07-24-21:16:43 | 97.985 | 242.189 | 0.305 | 104.873 | 123.87 |
| 2020-07-24-21:16:48 | 97.93 | 242.128 | 0.372 | 104.995 | 123.821 |
| 2020-07-24-21:16:54 | 97.981 | 242.162 | 0.375 | 105.249 | 123.844 |
| 2020-07-24-21:16:59 | 98.173 | 242.192 | 0.359 | 104.88 | 123.915 |
| 2020-07-24-21:17:05 | 97.928 | 242.157 | 0.37 | 104.918 | 123.941 |
| 2020-07-24-21:17:11 | 97.924 | 242.118 | 0.39 | 104.887 | 123.887 |
| 2020-07-24-21:17:16 | 97.981 | 242.1 | 0.316 | 104.832 | 123.852 |
| 2020-07-24-21:17:22 | 97.969 | 242.107 | 0.312 | 104.846 | 123.838 |
| 2020-07-24-21:17:27 | 97.947 | 242.068 | 0.329 | 104.809 | 123.837 |
| 2020-07-24-21:17:33 | 97.956 | 242.093 | 0.284 | 104.765 | 123.881 |
| 2020-07-24-21:17:39 | 98.027 | 242.179 | 0.343 | 104.92 | 123.92 |
| 2020-07-24-21:17:44 | 98.035 | 242.196 | 0.286 | 104.89 | 123.903 |
| 2020-07-24-21:17:50 | 97.964 | 242.097 | 0.29 | 104.827 | 123.834 |
| 2020-07-24-21:17:55 | 97.941 | 242.044 | 0.317 | 104.871 | 123.915 |
| 2020-07-24-21:18:01 | 98.005 | 242.155 | 0.768 | 104.9 | 123.859 |